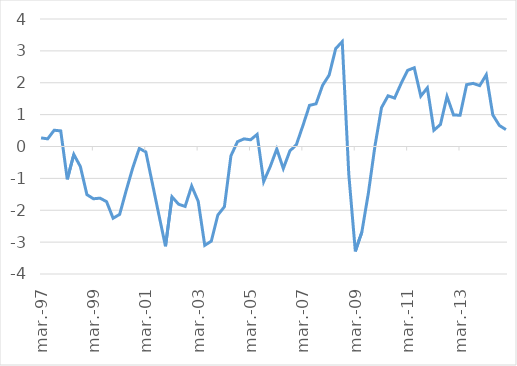
| Category | Hiato (%) |
|---|---|
| 1997-03-01 | 0.27 |
| 1997-06-01 | 0.24 |
| 1997-09-01 | 0.51 |
| 1997-12-01 | 0.49 |
| 1998-03-01 | -1.03 |
| 1998-06-01 | -0.25 |
| 1998-09-01 | -0.63 |
| 1998-12-01 | -1.51 |
| 1999-03-01 | -1.64 |
| 1999-06-01 | -1.62 |
| 1999-09-01 | -1.73 |
| 1999-12-01 | -2.25 |
| 2000-03-01 | -2.13 |
| 2000-06-01 | -1.38 |
| 2000-09-01 | -0.67 |
| 2000-12-01 | -0.06 |
| 2001-03-01 | -0.17 |
| 2001-06-01 | -1.16 |
| 2001-09-01 | -2.15 |
| 2001-12-01 | -3.13 |
| 2002-03-01 | -1.58 |
| 2002-06-01 | -1.81 |
| 2002-09-01 | -1.88 |
| 2002-12-01 | -1.24 |
| 2003-03-01 | -1.72 |
| 2003-06-01 | -3.1 |
| 2003-09-01 | -2.97 |
| 2003-12-01 | -2.15 |
| 2004-03-01 | -1.89 |
| 2004-06-01 | -0.29 |
| 2004-09-01 | 0.15 |
| 2004-12-01 | 0.24 |
| 2005-03-01 | 0.21 |
| 2005-06-01 | 0.38 |
| 2005-09-01 | -1.1 |
| 2005-12-01 | -0.63 |
| 2006-03-01 | -0.08 |
| 2006-06-01 | -0.69 |
| 2006-09-01 | -0.14 |
| 2006-12-01 | 0.06 |
| 2007-03-01 | 0.66 |
| 2007-06-01 | 1.29 |
| 2007-09-01 | 1.34 |
| 2007-12-01 | 1.92 |
| 2008-03-01 | 2.24 |
| 2008-06-01 | 3.07 |
| 2008-09-01 | 3.29 |
| 2008-12-01 | -0.87 |
| 2009-03-01 | -3.29 |
| 2009-06-01 | -2.68 |
| 2009-09-01 | -1.45 |
| 2009-12-01 | 0.02 |
| 2010-03-01 | 1.22 |
| 2010-06-01 | 1.59 |
| 2010-09-01 | 1.52 |
| 2010-12-01 | 1.98 |
| 2011-03-01 | 2.39 |
| 2011-06-01 | 2.47 |
| 2011-09-01 | 1.58 |
| 2011-12-01 | 1.84 |
| 2012-03-01 | 0.51 |
| 2012-06-01 | 0.69 |
| 2012-09-01 | 1.57 |
| 2012-12-01 | 0.99 |
| 2013-03-01 | 0.98 |
| 2013-06-01 | 1.94 |
| 2013-09-01 | 1.98 |
| 2013-12-01 | 1.91 |
| 2014-03-01 | 2.25 |
| 2014-06-01 | 0.99 |
| 2014-09-01 | 0.66 |
| 2014-12-01 | 0.53 |